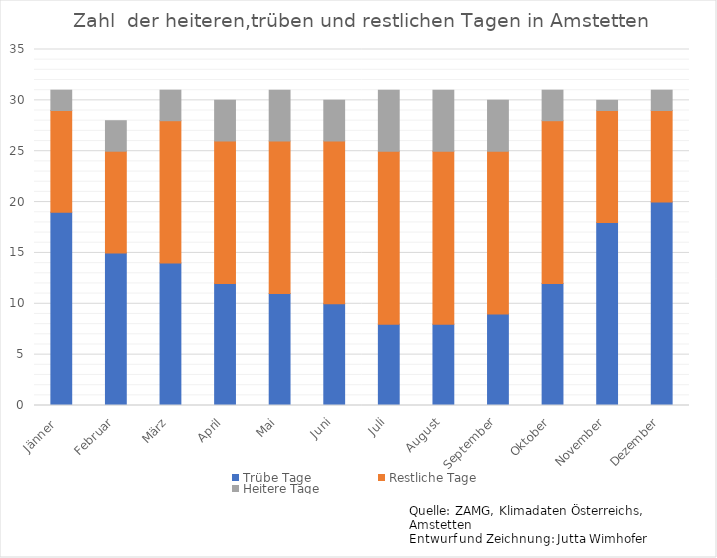
| Category | Trübe Tage | Restliche Tage | Heitere Tage  |
|---|---|---|---|
| Jänner  | 19 | 10 | 2 |
| Februar | 15 | 10 | 3 |
| März | 14 | 14 | 3 |
| April | 12 | 14 | 4 |
| Mai | 11 | 15 | 5 |
| Juni | 10 | 16 | 4 |
| Juli | 8 | 17 | 6 |
| August | 8 | 17 | 6 |
| September | 9 | 16 | 5 |
| Oktober | 12 | 16 | 3 |
| November | 18 | 11 | 1 |
| Dezember | 20 | 9 | 2 |